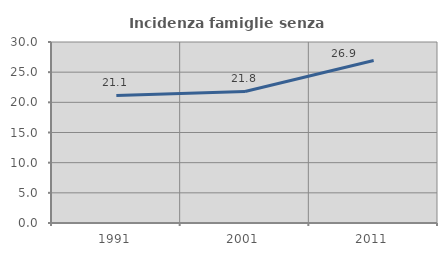
| Category | Incidenza famiglie senza nuclei |
|---|---|
| 1991.0 | 21.143 |
| 2001.0 | 21.796 |
| 2011.0 | 26.935 |